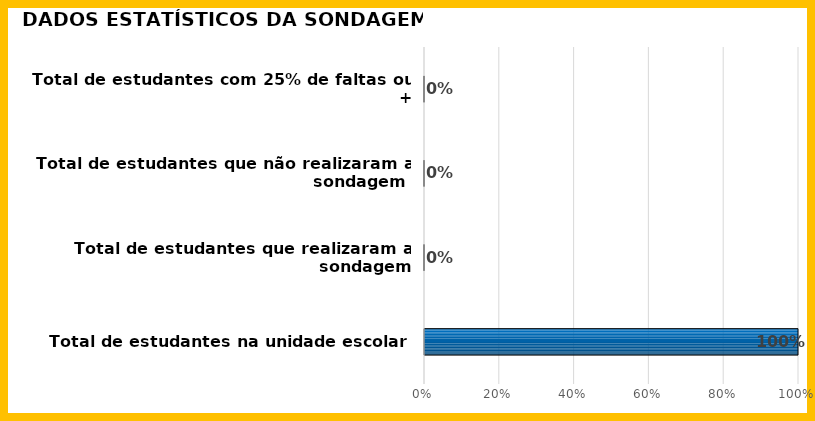
| Category | Series 3 |
|---|---|
| Total de estudantes na unidade escolar | 1 |
| Total de estudantes que realizaram a sondagem | 0 |
| Total de estudantes que não realizaram a sondagem  | 0 |
| Total de estudantes com 25% de faltas ou + | 0 |